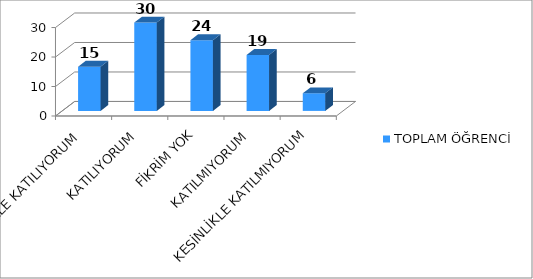
| Category | TOPLAM ÖĞRENCİ |
|---|---|
| KESİNLİKLE KATILIYORUM | 15 |
| KATILIYORUM | 30 |
| FİKRİM YOK | 24 |
| KATILMIYORUM | 19 |
| KESİNLİKLE KATILMIYORUM | 6 |